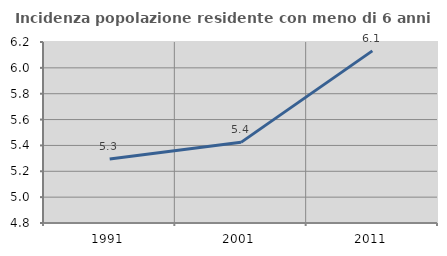
| Category | Incidenza popolazione residente con meno di 6 anni |
|---|---|
| 1991.0 | 5.296 |
| 2001.0 | 5.424 |
| 2011.0 | 6.131 |